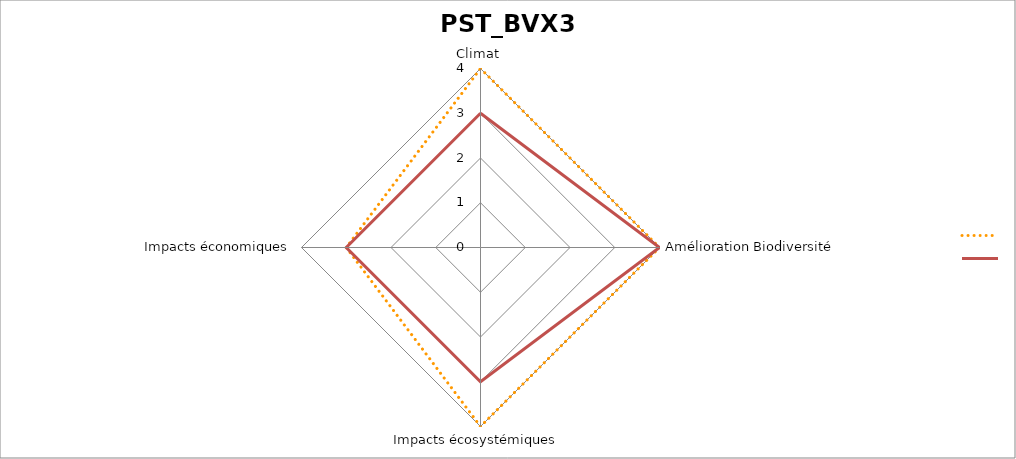
| Category | Series 0 | Series 1 |
|---|---|---|
| Climat | 4 | 3 |
| Amélioration Biodiversité | 4 | 4 |
| Impacts écosystémiques  | 4 | 3 |
| Impacts économiques | 3 | 3 |